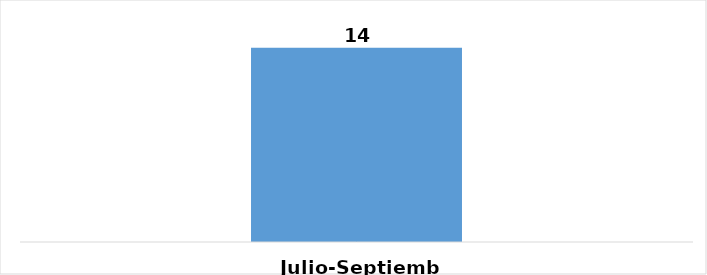
| Category | Total |
|---|---|
| Julio-Septiembre | 14 |